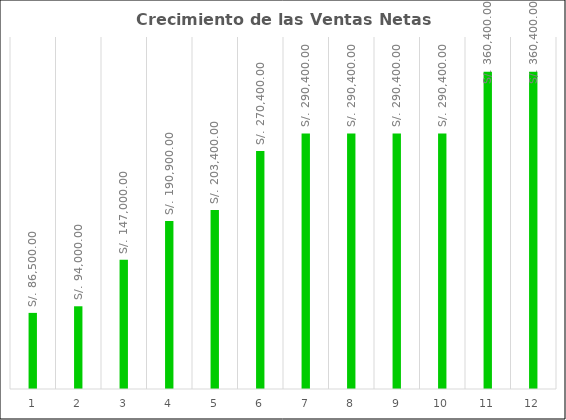
| Category | Series 0 |
|---|---|
| 0 | 86500 |
| 1 | 94000 |
| 2 | 147000 |
| 3 | 190900 |
| 4 | 203400 |
| 5 | 270400 |
| 6 | 290400 |
| 7 | 290400 |
| 8 | 290400 |
| 9 | 290400 |
| 10 | 360400 |
| 11 | 360400 |